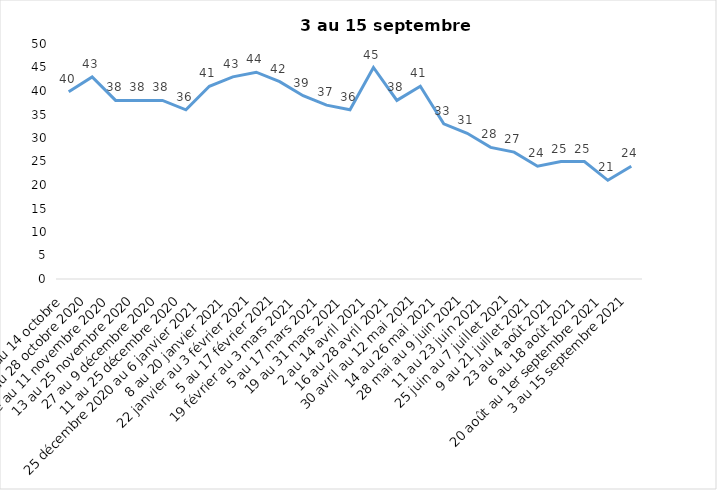
| Category | Toujours aux trois mesures |
|---|---|
| 2 au 14 octobre  | 39.85 |
| 16 au 28 octobre 2020 | 43 |
| 30 octobre au 11 novembre 2020 | 38 |
| 13 au 25 novembre 2020 | 38 |
| 27 au 9 décembre 2020 | 38 |
| 11 au 25 décembre 2020 | 36 |
| 25 décembre 2020 au 6 janvier 2021 | 41 |
| 8 au 20 janvier 2021 | 43 |
| 22 janvier au 3 février 2021 | 44 |
| 5 au 17 février 2021 | 42 |
| 19 février au 3 mars 2021 | 39 |
| 5 au 17 mars 2021 | 37 |
| 19 au 31 mars 2021 | 36 |
| 2 au 14 avril 2021 | 45 |
| 16 au 28 avril 2021 | 38 |
| 30 avril au 12 mai 2021 | 41 |
| 14 au 26 mai 2021 | 33 |
| 28 mai au 9 juin 2021 | 31 |
| 11 au 23 juin 2021 | 28 |
| 25 juin au 7 juillet 2021 | 27 |
| 9 au 21 juillet 2021 | 24 |
| 23 au 4 août 2021 | 25 |
| 6 au 18 août 2021 | 25 |
| 20 août au 1er septembre 2021 | 21 |
| 3 au 15 septembre 2021 | 24 |